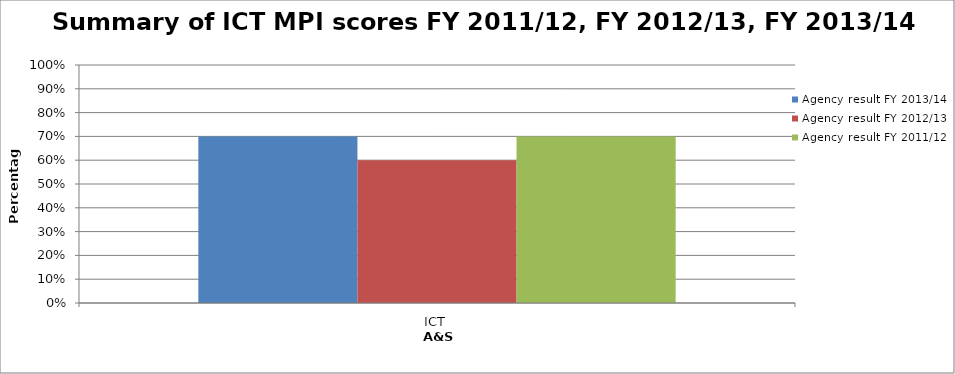
| Category | Agency result FY 2013/14  | Agency result FY 2012/13  | Agency result FY 2011/12  |
|---|---|---|---|
| ICT | 0.7 | 0.6 | 0.7 |